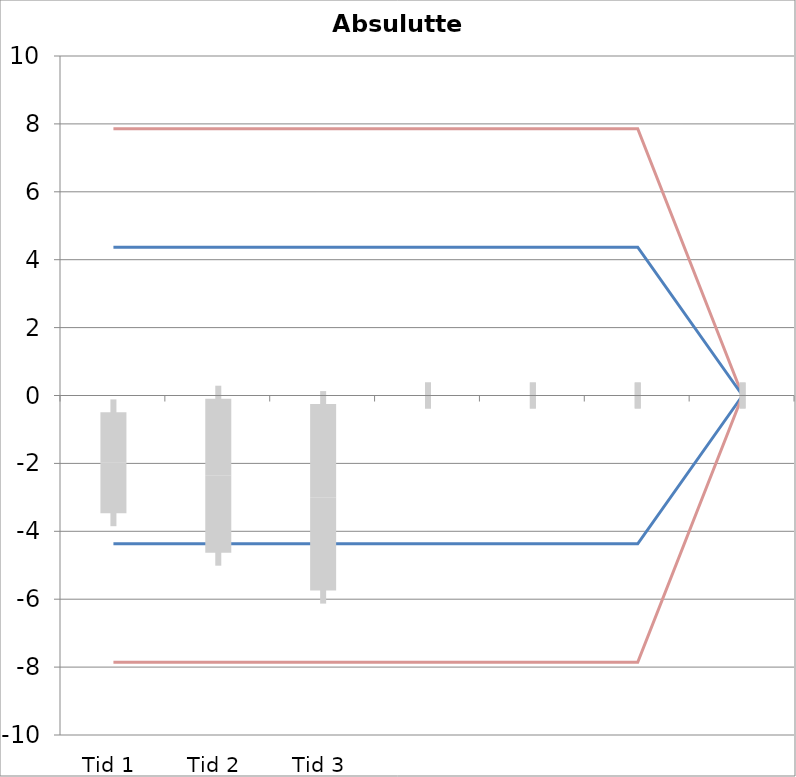
| Category | 1 | 2 | 3 | 4 | 5 | 6 | 7 | 8 | 9 | 10 | 11 | 12 | 13 | 14 | 15 | 16 | 17 | 18 | 19 | 20 | TEa | B | -B | -TEa | M |
|---|---|---|---|---|---|---|---|---|---|---|---|---|---|---|---|---|---|---|---|---|---|---|---|---|---|
| Tid 1 | -2.3 | -1.4 | -4.4 | -1 | -1.4 | -6.8 | -4 | -0.2 | -0.4 | 0.2 | -0.1 | 0 | 0 | 0 | 0 | 0 | 0 | 0 | 0 | 0 | 7.857 | 4.37 | -4.37 | -7.857 | -1.982 |
| Tid 2 | -1.9 | -1.4 | -4 | -0.9 | 0 | 0 | 0 | -0.2 | -8.3 | -2.2 | 0 | 0 | 0 | 0 | 0 | 0 | 0 | 0 | 0 | 0 | 7.857 | 4.37 | -4.37 | -7.857 | -2.362 |
| Tid 3 | -3.3 | -2 | -5.3 | -1.4 | 0 | 0 | 0 | 0 | 0 | 0 | 0 | 0 | 0 | 0 | 0 | 0 | 0 | 0 | 0 | 0 | 7.857 | 4.37 | -4.37 | -7.857 | -3 |